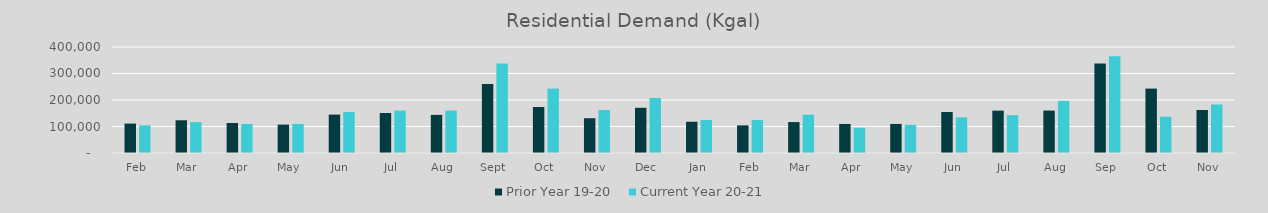
| Category | Prior Year 19-20  | Current Year 20-21 |
|---|---|---|
| Feb | 111009.962 | 104204.224 |
| Mar | 123525.131 | 116687.491 |
| Apr | 113258.787 | 109598.965 |
| May | 107128.051 | 109656.015 |
| Jun | 144930.453 | 154696.236 |
| Jul | 151028.014 | 159889.353 |
| Aug | 143816.337 | 160013.985 |
| Sep | 260607.456 | 337995.641 |
| Oct | 173601.368 | 243049.084 |
| Nov | 131198.833 | 162175.563 |
| Dec | 170629.384 | 207737.904 |
| Jan | 117899.625 | 124779.797 |
| Feb | 104204.224 | 124538.238 |
| Mar | 116687.491 | 144510.137 |
| Apr | 109598.965 | 95313.825 |
| May | 109656.015 | 106271.913 |
| Jun | 154696.236 | 134556.172 |
| Jul | 159889.353 | 142779.003 |
| Aug | 160013.985 | 196888.231 |
| Sep | 337995.641 | 364911.478 |
| Oct | 243049.084 | 137121.969 |
| Nov | 162175.563 | 182996.966 |